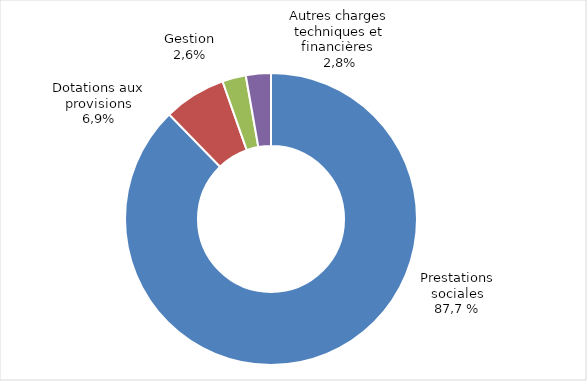
| Category | Series 0 |
|---|---|
| Prestations sociales | 14102.197 |
| Dotations aux provisions | 1110.176 |
| Gestion | 420.719 |
| Autres charges techniques et financières | 445.108 |